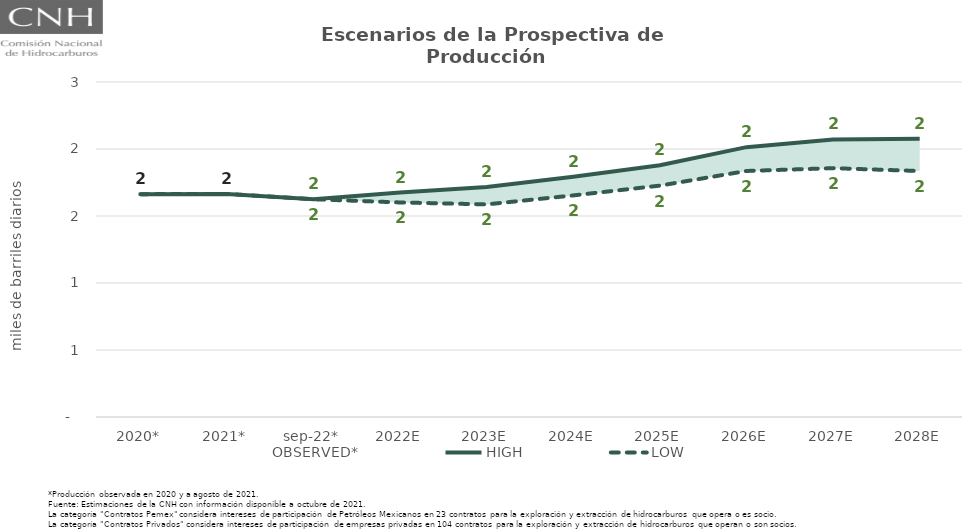
| Category | OBSERVED* | HIGH | LOW |
|---|---|---|---|
| 2020* | 1.663 | 1.663 | 1.663 |
| 2021* | 1.665 | 1.665 | 1.665 |
| sep-22* | 1.625 | 1.625 | 1.625 |
| 2022E | 1.645 | 1.675 | 1.601 |
| 2023E | 1.679 | 1.716 | 1.587 |
| 2024E | 1.75 | 1.792 | 1.654 |
| 2025E | 1.81 | 1.879 | 1.727 |
| 2026E | 1.909 | 2.014 | 1.836 |
| 2027E | 1.93 | 2.072 | 1.857 |
| 2028E | 1.907 | 2.076 | 1.836 |